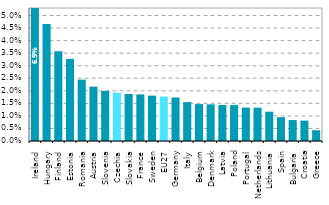
| Category | Series 0 |
|---|---|
| Ireland | 0.069 |
| Hungary | 0.047 |
| Finland | 0.036 |
| Estonia | 0.033 |
| Romania | 0.024 |
| Austria | 0.022 |
| Slovenia | 0.02 |
| Czechia | 0.019 |
| Slovakia | 0.019 |
| France | 0.019 |
| Sweden | 0.018 |
| EU27 | 0.018 |
| Germany | 0.017 |
| Italy | 0.016 |
| Belgium | 0.015 |
| Denmark | 0.015 |
| Latvia | 0.014 |
| Poland | 0.014 |
| Portugal | 0.013 |
| Netherlands | 0.013 |
| Lithuania | 0.012 |
| Spain | 0.009 |
| Bulgaria | 0.008 |
| Croatia | 0.008 |
| Greece | 0.004 |